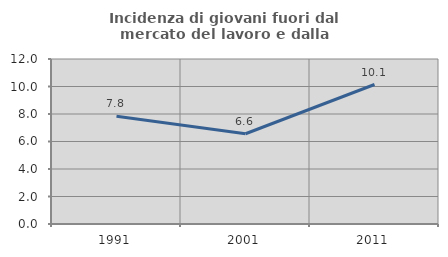
| Category | Incidenza di giovani fuori dal mercato del lavoro e dalla formazione  |
|---|---|
| 1991.0 | 7.829 |
| 2001.0 | 6.563 |
| 2011.0 | 10.145 |